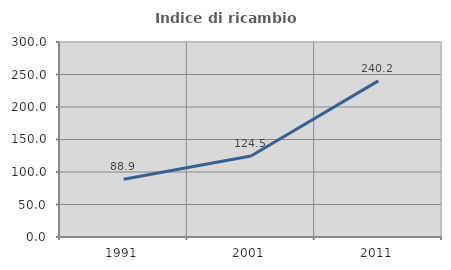
| Category | Indice di ricambio occupazionale  |
|---|---|
| 1991.0 | 88.868 |
| 2001.0 | 124.55 |
| 2011.0 | 240.232 |